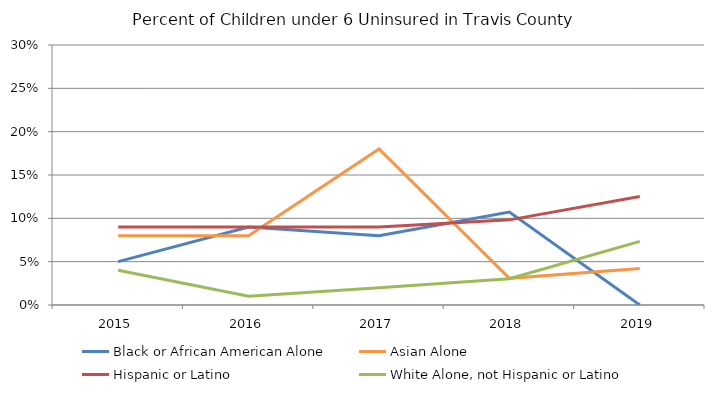
| Category | Black or African American Alone | Asian Alone | Hispanic or Latino | White Alone, not Hispanic or Latino |
|---|---|---|---|---|
| 2015.0 | 0.05 | 0.08 | 0.09 | 0.04 |
| 2016.0 | 0.09 | 0.08 | 0.09 | 0.01 |
| 2017.0 | 0.08 | 0.18 | 0.09 | 0.02 |
| 2018.0 | 0.107 | 0.031 | 0.098 | 0.03 |
| 2019.0 | 0 | 0.042 | 0.125 | 0.073 |